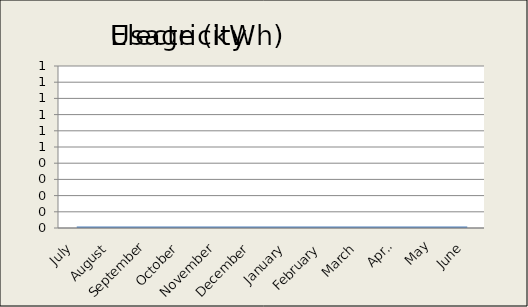
| Category | Electricity |
|---|---|
| 0 | 0 |
| 1 | 0 |
| 2 | 0 |
| 3 | 0 |
| 4 | 0 |
| 5 | 0 |
| 6 | 0 |
| 7 | 0 |
| 8 | 0 |
| 9 | 0 |
| 10 | 0 |
| 11 | 0 |